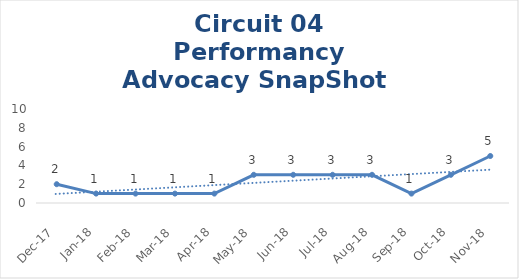
| Category | Circuit 04 |
|---|---|
| Dec-17 | 2 |
| Jan-18 | 1 |
| Feb-18 | 1 |
| Mar-18 | 1 |
| Apr-18 | 1 |
| May-18 | 3 |
| Jun-18 | 3 |
| Jul-18 | 3 |
| Aug-18 | 3 |
| Sep-18 | 1 |
| Oct-18 | 3 |
| Nov-18 | 5 |